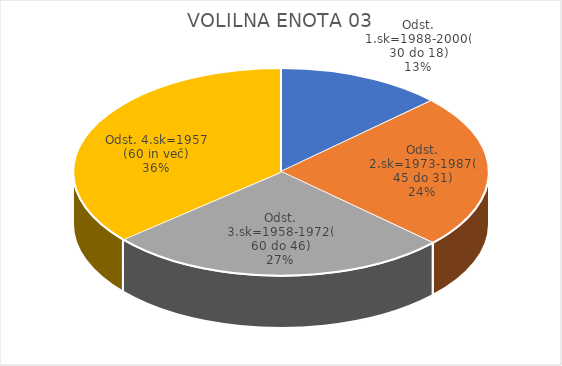
| Category | VOLILNA ENOTA 03 |
|---|---|
| Odst. 1.sk=1988-2000(30 do 18) | 7.27 |
| Odst. 2.sk=1973-1987(45 do 31) | 13.5 |
| Odst. 3.sk=1958-1972(60 do 46) | 15.01 |
| Odst. 4.sk=1957 (60 in več) | 20.36 |